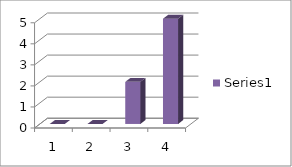
| Category | Series 0 |
|---|---|
| 0 | 0 |
| 1 | 0 |
| 2 | 2 |
| 3 | 5 |